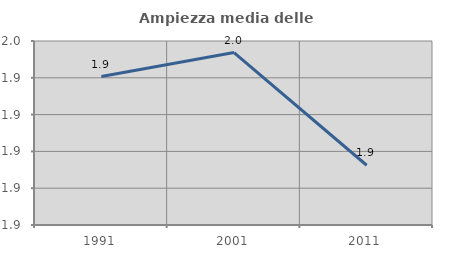
| Category | Ampiezza media delle famiglie |
|---|---|
| 1991.0 | 1.941 |
| 2001.0 | 1.954 |
| 2011.0 | 1.892 |